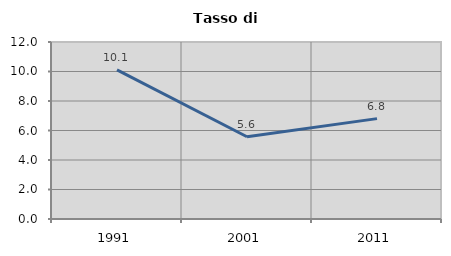
| Category | Tasso di disoccupazione   |
|---|---|
| 1991.0 | 10.106 |
| 2001.0 | 5.577 |
| 2011.0 | 6.805 |